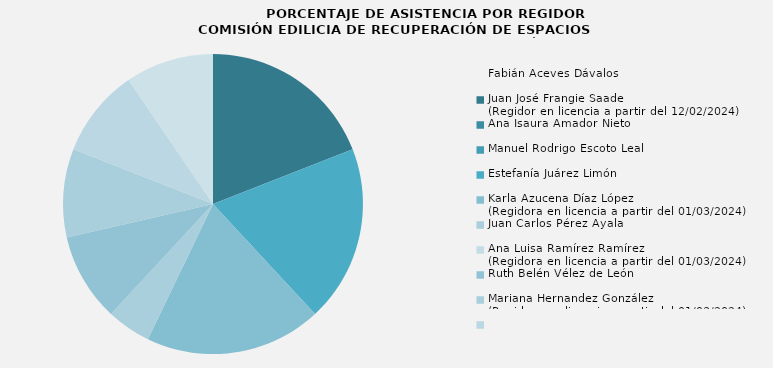
| Category | Fabián Aceves Dávalos |
|---|---|
| Fabián Aceves Dávalos | 100 |
| Juan José Frangie Saade
(Regidor en licencia a partir del 12/02/2024) | 0 |
| Ana Isaura Amador Nieto | 0 |
| Manuel Rodrigo Escoto Leal | 100 |
| Estefanía Juárez Limón | 100 |
| Karla Azucena Díaz López
(Regidora en licencia a partir del 01/03/2024) | 25 |
| Juan Carlos Pérez Ayala  | 0 |
| Ana Luisa Ramírez Ramírez
(Regidora en licencia a partir del 01/03/2024) | 50 |
| Ruth Belén Vélez de León | 50 |
| Mariana Hernandez González
(Regidora en licencia a partir del 01/03/2024) | 50 |
| Eloy Franisco Aquino Herrán | 50 |